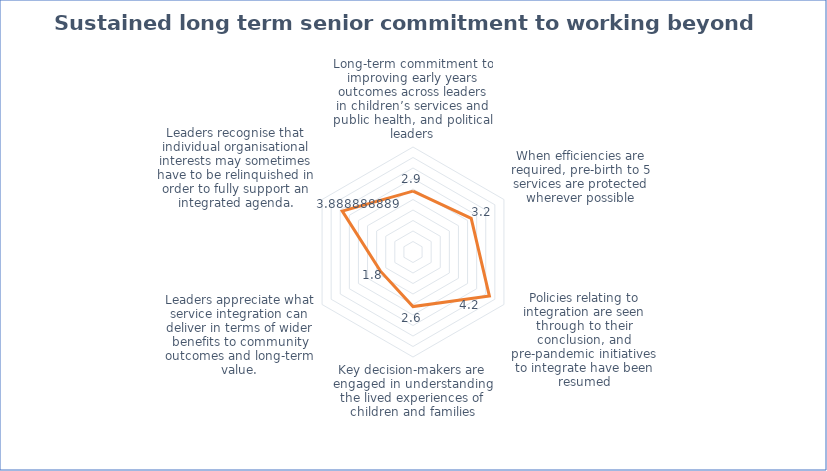
| Category | Series 0 |
|---|---|
| Long-term commitment to improving early years outcomes across leaders in children’s services and public health, and political leaders | 2.9 |
| When efficiencies are required, pre-birth to 5 services are protected wherever possible | 3.2 |
| Policies relating to integration are seen through to their conclusion, and pre-pandemic initiatives to integrate have been resumed | 4.2 |
| Key decision-makers are engaged in understanding the lived experiences of children and families | 2.6 |
| Leaders appreciate what service integration can deliver in terms of wider benefits to community outcomes and long-term value. | 1.8 |
| Leaders recognise that individual organisational interests may sometimes have to be relinquished in order to fully support an integrated agenda. | 3.889 |